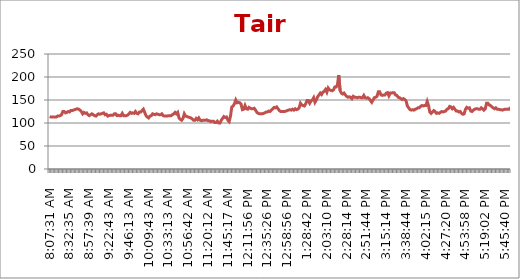
| Category | Tair (°Cx10) |
|---|---|
| 0.3385532407407407 | 114 |
| 0.3396412037037037 | 113 |
| 0.3407291666666667 | 113 |
| 0.3418171296296297 | 113 |
| 0.34290509259259255 | 113 |
| 0.34399305555555554 | 113 |
| 0.3450810185185185 | 115 |
| 0.34616898148148145 | 115 |
| 0.34725694444444444 | 116 |
| 0.34943287037037035 | 118 |
| 0.35052083333333334 | 125 |
| 0.3516087962962963 | 125 |
| 0.3526967592592593 | 122 |
| 0.3537847222222222 | 123 |
| 0.35487268518518517 | 125 |
| 0.35596064814814815 | 124 |
| 0.3570486111111111 | 127 |
| 0.35813657407407407 | 127 |
| 0.35922453703703705 | 128 |
| 0.36031250000000004 | 129 |
| 0.36140046296296297 | 130 |
| 0.36248842592592595 | 131 |
| 0.3646643518518518 | 130 |
| 0.3657523148148148 | 128 |
| 0.3668402777777778 | 125 |
| 0.3679282407407407 | 120 |
| 0.3690162037037037 | 123 |
| 0.3701041666666667 | 121 |
| 0.37119212962962966 | 122 |
| 0.3722800925925926 | 118 |
| 0.3733680555555556 | 116 |
| 0.37445601851851856 | 118 |
| 0.37554398148148144 | 120 |
| 0.3766319444444444 | 118 |
| 0.3777199074074074 | 116 |
| 0.37880787037037034 | 115 |
| 0.3798958333333333 | 118 |
| 0.3809837962962963 | 120 |
| 0.3820717592592593 | 119 |
| 0.3831597222222222 | 120 |
| 0.3842476851851852 | 121 |
| 0.3853356481481482 | 122 |
| 0.38642361111111106 | 118 |
| 0.38751157407407405 | 119 |
| 0.38968749999999996 | 115 |
| 0.39077546296296295 | 116 |
| 0.39186342592592593 | 117 |
| 0.3929513888888889 | 117 |
| 0.39403935185185185 | 117 |
| 0.39512731481481483 | 120 |
| 0.3962152777777778 | 120 |
| 0.3973032407407407 | 116 |
| 0.3983912037037037 | 117 |
| 0.39947916666666666 | 116 |
| 0.40056712962962965 | 116 |
| 0.4016550925925926 | 121 |
| 0.40274305555555556 | 116 |
| 0.40383101851851855 | 116 |
| 0.4049189814814815 | 116 |
| 0.40600694444444446 | 117 |
| 0.40709490740740745 | 120 |
| 0.4081828703703703 | 123 |
| 0.4092708333333333 | 121 |
| 0.4103587962962963 | 122 |
| 0.4114467592592593 | 121 |
| 0.4125347222222222 | 125 |
| 0.4136226851851852 | 121 |
| 0.4147106481481482 | 120 |
| 0.4157986111111111 | 124 |
| 0.4168865740740741 | 124 |
| 0.4179745370370371 | 127 |
| 0.41906249999999995 | 130 |
| 0.42015046296296293 | 123 |
| 0.4212384259259259 | 116 |
| 0.4223263888888889 | 113 |
| 0.42341435185185183 | 111 |
| 0.4245023148148148 | 115 |
| 0.4255902777777778 | 116 |
| 0.42667824074074073 | 120 |
| 0.4277662037037037 | 119 |
| 0.4288541666666667 | 118 |
| 0.4299421296296296 | 120 |
| 0.43103009259259256 | 119 |
| 0.43211805555555555 | 118 |
| 0.43320601851851853 | 118 |
| 0.43429398148148146 | 120 |
| 0.43538194444444445 | 116 |
| 0.43646990740740743 | 115 |
| 0.43755787037037036 | 115 |
| 0.43864583333333335 | 115 |
| 0.43973379629629633 | 116 |
| 0.4408217592592592 | 116 |
| 0.4419097222222222 | 116 |
| 0.4429976851851852 | 118 |
| 0.44408564814814816 | 120 |
| 0.4451736111111111 | 123 |
| 0.4462615740740741 | 120 |
| 0.44734953703703706 | 123 |
| 0.4484375 | 111 |
| 0.449525462962963 | 108 |
| 0.4506018518518518 | 106 |
| 0.4516898148148148 | 110 |
| 0.4527777777777778 | 120 |
| 0.4538657407407407 | 115 |
| 0.4549537037037037 | 114 |
| 0.4560416666666667 | 113 |
| 0.45712962962962966 | 112 |
| 0.4582175925925926 | 111 |
| 0.4593055555555556 | 109 |
| 0.46039351851851856 | 106 |
| 0.46148148148148144 | 106 |
| 0.4625694444444444 | 110 |
| 0.4636574074074074 | 107 |
| 0.46474537037037034 | 111 |
| 0.4658333333333333 | 106 |
| 0.4669212962962963 | 105 |
| 0.4680092592592593 | 106 |
| 0.4690972222222222 | 106 |
| 0.4701851851851852 | 106 |
| 0.4712731481481482 | 107 |
| 0.47236111111111106 | 105 |
| 0.47344907407407405 | 105 |
| 0.47453703703703703 | 103 |
| 0.47562499999999996 | 104 |
| 0.47671296296296295 | 104 |
| 0.47780092592592593 | 101 |
| 0.4788888888888889 | 101 |
| 0.47997685185185185 | 104 |
| 0.4821527777777778 | 100 |
| 0.4832407407407407 | 100 |
| 0.4843287037037037 | 106 |
| 0.48541666666666666 | 110 |
| 0.4865162037037037 | 114 |
| 0.48760416666666667 | 112 |
| 0.4886921296296296 | 113 |
| 0.4897800925925926 | 106 |
| 0.49086805555555557 | 103 |
| 0.4919560185185185 | 115 |
| 0.4930439814814815 | 135 |
| 0.49413194444444447 | 137 |
| 0.4952314814814815 | 142 |
| 0.4963194444444445 | 150 |
| 0.49740740740740735 | 144 |
| 0.49849537037037034 | 145 |
| 0.4995833333333333 | 144 |
| 0.5006712962962964 | 141 |
| 0.5039351851851852 | 129 |
| 0.5050231481481481 | 130 |
| 0.5061111111111111 | 138 |
| 0.507199074074074 | 131 |
| 0.508287037037037 | 130 |
| 0.509375 | 134 |
| 0.510462962962963 | 132 |
| 0.511550925925926 | 131 |
| 0.5126388888888889 | 131 |
| 0.5137268518518519 | 132 |
| 0.5148148148148148 | 128 |
| 0.5159027777777777 | 123 |
| 0.5169907407407407 | 121 |
| 0.5180787037037037 | 120 |
| 0.5191666666666667 | 120 |
| 0.5202546296296297 | 120 |
| 0.5213425925925926 | 121 |
| 0.5224305555555556 | 122 |
| 0.5235185185185185 | 124 |
| 0.5246064814814815 | 124 |
| 0.5256944444444445 | 126 |
| 0.5267824074074073 | 125 |
| 0.5278703703703703 | 128 |
| 0.5289583333333333 | 131 |
| 0.5300462962962963 | 134 |
| 0.5311342592592593 | 133 |
| 0.5322222222222223 | 135 |
| 0.5333101851851852 | 131 |
| 0.5343981481481481 | 127 |
| 0.5354861111111111 | 125 |
| 0.5365740740740741 | 125 |
| 0.537662037037037 | 125 |
| 0.53875 | 125 |
| 0.5398379629629629 | 126 |
| 0.5409259259259259 | 127 |
| 0.5420138888888889 | 128 |
| 0.5431018518518519 | 129 |
| 0.5441898148148149 | 128 |
| 0.5452777777777778 | 130 |
| 0.5463657407407407 | 128 |
| 0.5474537037037037 | 131 |
| 0.5485416666666666 | 129 |
| 0.5496296296296296 | 130 |
| 0.5507175925925926 | 133 |
| 0.5518055555555555 | 143 |
| 0.5528935185185185 | 139 |
| 0.5539814814814815 | 138 |
| 0.5572453703703704 | 137 |
| 0.5605092592592592 | 142 |
| 0.5615972222222222 | 149 |
| 0.5626851851851852 | 149 |
| 0.5659490740740741 | 143 |
| 0.567037037037037 | 148 |
| 0.568125 | 150 |
| 0.569212962962963 | 155 |
| 0.570300925925926 | 145 |
| 0.5724768518518518 | 150 |
| 0.5735648148148148 | 157 |
| 0.5790046296296296 | 161 |
| 0.5800925925925926 | 165 |
| 0.5811805555555556 | 162 |
| 0.5822685185185185 | 167 |
| 0.5833564814814814 | 169 |
| 0.5844444444444444 | 173 |
| 0.5855324074074074 | 167 |
| 0.5866203703703704 | 176 |
| 0.5877083333333334 | 172 |
| 0.5887962962962963 | 171 |
| 0.5898842592592592 | 170 |
| 0.5909722222222222 | 172 |
| 0.5931481481481481 | 178 |
| 0.5942361111111111 | 178 |
| 0.5953240740740741 | 183 |
| 0.596412037037037 | 204 |
| 0.5975 | 171 |
| 0.598587962962963 | 165 |
| 0.599675925925926 | 163 |
| 0.6007638888888889 | 165 |
| 0.6018518518518519 | 161 |
| 0.6029398148148148 | 158 |
| 0.6040277777777777 | 156 |
| 0.6051157407407407 | 157 |
| 0.6062037037037037 | 156 |
| 0.6072916666666667 | 153 |
| 0.6083796296296297 | 158 |
| 0.6094675925925926 | 156 |
| 0.6105555555555556 | 156 |
| 0.6116435185185185 | 155 |
| 0.6127314814814815 | 156 |
| 0.6138194444444445 | 156 |
| 0.6149074074074073 | 155 |
| 0.6159953703703703 | 155 |
| 0.6170833333333333 | 160 |
| 0.6181712962962963 | 155 |
| 0.6192592592592593 | 154 |
| 0.6203472222222223 | 155 |
| 0.6214351851851853 | 153 |
| 0.6225231481481481 | 149 |
| 0.6236111111111111 | 145 |
| 0.6246990740740741 | 150 |
| 0.625787037037037 | 155 |
| 0.626875 | 156 |
| 0.627962962962963 | 158 |
| 0.6290509259259259 | 168 |
| 0.6301388888888889 | 168 |
| 0.6312268518518519 | 161 |
| 0.6323148148148149 | 160 |
| 0.6334027777777778 | 161 |
| 0.6344907407407407 | 161 |
| 0.6355787037037037 | 165 |
| 0.6366666666666666 | 166 |
| 0.6377546296296296 | 159 |
| 0.6388425925925926 | 165 |
| 0.6399305555555556 | 165 |
| 0.6410185185185185 | 166 |
| 0.6421064814814815 | 166 |
| 0.6431944444444445 | 161 |
| 0.6442824074074074 | 160 |
| 0.6453703703703704 | 156 |
| 0.6464583333333334 | 155 |
| 0.6475462962962962 | 153 |
| 0.6486342592592592 | 151 |
| 0.6497222222222222 | 153 |
| 0.6508101851851852 | 151 |
| 0.6518981481481482 | 148 |
| 0.6529861111111112 | 137 |
| 0.6540740740740741 | 133 |
| 0.655162037037037 | 129 |
| 0.65625 | 128 |
| 0.657337962962963 | 129 |
| 0.6584259259259259 | 128 |
| 0.6595138888888888 | 130 |
| 0.6606018518518518 | 131 |
| 0.6616898148148148 | 133 |
| 0.6627777777777778 | 133 |
| 0.6638657407407408 | 136 |
| 0.6649537037037038 | 138 |
| 0.6660416666666666 | 137 |
| 0.6671296296296297 | 138 |
| 0.6682291666666668 | 138 |
| 0.6693171296296296 | 147 |
| 0.6704050925925925 | 138 |
| 0.6714930555555556 | 124 |
| 0.6725810185185185 | 121 |
| 0.6736805555555555 | 124 |
| 0.6747685185185185 | 127 |
| 0.6769444444444445 | 125 |
| 0.6780324074074073 | 121 |
| 0.6791203703703704 | 122 |
| 0.6802083333333333 | 121 |
| 0.6812962962962964 | 123 |
| 0.6823842592592593 | 125 |
| 0.6834722222222221 | 124 |
| 0.6845601851851852 | 125 |
| 0.6856481481481481 | 126 |
| 0.6878240740740741 | 130 |
| 0.6889120370370371 | 131 |
| 0.69 | 136 |
| 0.691087962962963 | 135 |
| 0.6921759259259259 | 131 |
| 0.6943518518518519 | 134 |
| 0.6954398148148148 | 130 |
| 0.6965277777777777 | 126 |
| 0.6976157407407407 | 126 |
| 0.6987037037037037 | 124 |
| 0.6997916666666667 | 125 |
| 0.7008796296296297 | 121 |
| 0.7019675925925926 | 119 |
| 0.7030555555555557 | 120 |
| 0.7041435185185185 | 130 |
| 0.7052314814814814 | 134 |
| 0.7074074074074074 | 132 |
| 0.7084953703703704 | 133 |
| 0.7095833333333333 | 126 |
| 0.7106712962962963 | 125 |
| 0.7117592592592592 | 128 |
| 0.7128472222222223 | 130 |
| 0.7139351851851852 | 131 |
| 0.715023148148148 | 131 |
| 0.7161111111111111 | 130 |
| 0.717199074074074 | 130 |
| 0.718287037037037 | 133 |
| 0.719375 | 131 |
| 0.720462962962963 | 128 |
| 0.721550925925926 | 131 |
| 0.7226388888888889 | 143 |
| 0.7237268518518518 | 143 |
| 0.7269907407407407 | 139 |
| 0.7280787037037038 | 138 |
| 0.7291666666666666 | 135 |
| 0.7302546296296296 | 133 |
| 0.7313425925925926 | 131 |
| 0.7324305555555556 | 133 |
| 0.7335185185185185 | 130 |
| 0.7346064814814816 | 130 |
| 0.7356944444444444 | 129 |
| 0.7367824074074073 | 129 |
| 0.7378703703703704 | 128 |
| 0.7389583333333333 | 129 |
| 0.7400462962962964 | 130 |
| 0.7411342592592592 | 130 |
| 0.7422222222222222 | 130 |
| 0.7433101851851852 | 130 |
| 0.7443981481481482 | 134 |